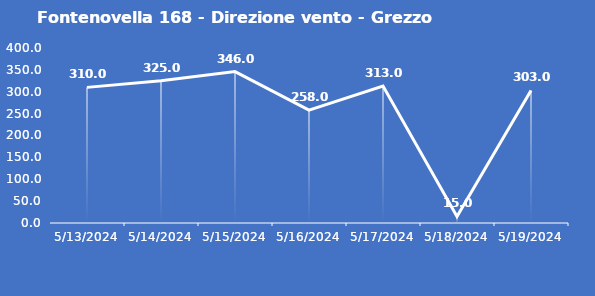
| Category | Fontenovella 168 - Direzione vento - Grezzo (°N) |
|---|---|
| 5/13/24 | 310 |
| 5/14/24 | 325 |
| 5/15/24 | 346 |
| 5/16/24 | 258 |
| 5/17/24 | 313 |
| 5/18/24 | 15 |
| 5/19/24 | 303 |